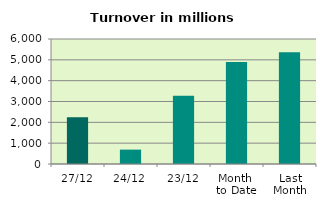
| Category | Series 0 |
|---|---|
| 27/12 | 2243.242 |
| 24/12 | 690.082 |
| 23/12 | 3270.783 |
| Month 
to Date | 4894.148 |
| Last
Month | 5362.851 |